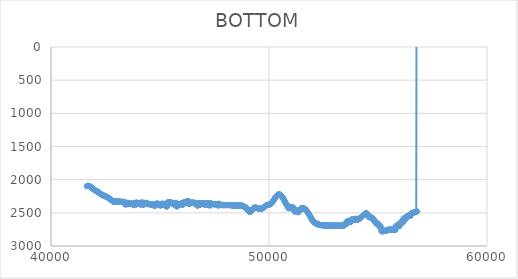
| Category | BOTTOM |
|---|---|
| 41642.9925 | 2099.07 |
| 41650.1262 | 2097.25 |
| 41660.3657 | 2095.79 |
| 41670.6056 | 2094.67 |
| 41680.8456 | 2093.88 |
| 41691.0856 | 2093.4 |
| 41701.3256 | 2093.23 |
| 41711.5656 | 2093.35 |
| 41721.8055 | 2093.74 |
| 41732.0455 | 2094.4 |
| 41742.2855 | 2095.29 |
| 41752.5255 | 2096.42 |
| 41762.7654 | 2097.77 |
| 41773.0054 | 2099.32 |
| 41783.2454 | 2101.06 |
| 41793.4854 | 2102.98 |
| 41803.7254 | 2105.06 |
| 41813.9653 | 2107.28 |
| 41824.2053 | 2109.64 |
| 41834.4453 | 2112.12 |
| 41844.6853 | 2114.7 |
| 41854.9253 | 2117.37 |
| 41865.1652 | 2120.12 |
| 41875.4052 | 2122.93 |
| 41885.6452 | 2125.8 |
| 41895.8852 | 2128.69 |
| 41906.1252 | 2131.61 |
| 41916.3651 | 2134.53 |
| 41926.6051 | 2137.45 |
| 41936.8451 | 2140.34 |
| 41947.0851 | 2143.2 |
| 41957.3251 | 2146 |
| 41967.565 | 2148.75 |
| 41977.805 | 2151.41 |
| 41988.045 | 2153.98 |
| 41998.285 | 2156.45 |
| 42008.525 | 2158.8 |
| 42018.7649 | 2161.01 |
| 42029.0049 | 2163.08 |
| 42039.2449 | 2165.02 |
| 42049.4849 | 2166.87 |
| 42059.7248 | 2168.65 |
| 42069.9648 | 2170.39 |
| 42080.2048 | 2172.11 |
| 42090.4448 | 2173.83 |
| 42100.6848 | 2175.59 |
| 42110.9247 | 2177.4 |
| 42121.1647 | 2179.31 |
| 42131.4047 | 2181.31 |
| 42141.6447 | 2183.42 |
| 42151.8847 | 2185.62 |
| 42162.1246 | 2187.89 |
| 42172.3646 | 2190.23 |
| 42182.6046 | 2192.63 |
| 42192.8446 | 2195.07 |
| 42203.0846 | 2197.54 |
| 42213.3245 | 2200.03 |
| 42223.5645 | 2202.53 |
| 42233.8045 | 2205.04 |
| 42244.0445 | 2207.52 |
| 42254.2845 | 2209.98 |
| 42264.5244 | 2212.41 |
| 42274.7644 | 2214.79 |
| 42285.0044 | 2217.11 |
| 42295.2444 | 2219.36 |
| 42305.4843 | 2221.53 |
| 42315.7243 | 2223.62 |
| 42325.9643 | 2225.61 |
| 42336.2043 | 2227.52 |
| 42346.4443 | 2229.36 |
| 42356.6842 | 2231.13 |
| 42366.9242 | 2232.84 |
| 42377.1642 | 2234.48 |
| 42387.4042 | 2236.08 |
| 42397.6442 | 2237.63 |
| 42407.8841 | 2239.13 |
| 42418.1241 | 2240.61 |
| 42428.3641 | 2242.05 |
| 42438.6041 | 2243.47 |
| 42448.8441 | 2244.87 |
| 42459.084 | 2246.26 |
| 42469.324 | 2247.65 |
| 42479.564 | 2249.03 |
| 42489.804 | 2250.42 |
| 42500.0439 | 2251.82 |
| 42510.2839 | 2253.23 |
| 42520.5239 | 2254.67 |
| 42530.7639 | 2256.14 |
| 42541.0039 | 2257.64 |
| 42551.2438 | 2259.18 |
| 42561.4838 | 2260.77 |
| 42571.7238 | 2262.4 |
| 42581.9638 | 2264.1 |
| 42592.2038 | 2265.85 |
| 42602.4437 | 2267.68 |
| 42612.6837 | 2269.57 |
| 42622.9237 | 2271.55 |
| 42633.1637 | 2273.62 |
| 42643.4037 | 2275.77 |
| 42653.6436 | 2278.01 |
| 42663.8836 | 2280.33 |
| 42674.1236 | 2282.72 |
| 42684.3636 | 2285.19 |
| 42694.6035 | 2287.72 |
| 42704.8435 | 2290.31 |
| 42715.0835 | 2292.96 |
| 42725.3235 | 2295.65 |
| 42735.5635 | 2298.39 |
| 42745.8034 | 2301.17 |
| 42756.0434 | 2303.98 |
| 42766.2834 | 2306.82 |
| 42776.5234 | 2309.68 |
| 42786.7634 | 2312.56 |
| 42797.0033 | 2315.45 |
| 42807.2433 | 2318.35 |
| 42817.4833 | 2321.26 |
| 42827.7233 | 2324.15 |
| 42837.9632 | 2327.04 |
| 42848.2032 | 2329.92 |
| 42858.4432 | 2330.03 |
| 42868.6832 | 2330.14 |
| 42878.9232 | 2330.25 |
| 42889.1631 | 2330.36 |
| 42899.4031 | 2330.47 |
| 42909.6431 | 2330.58 |
| 42919.8831 | 2330.69 |
| 42930.1231 | 2330.8 |
| 42940.363 | 2330.91 |
| 42950.603 | 2331.03 |
| 42960.843 | 2331.14 |
| 42971.083 | 2331.25 |
| 42981.3229 | 2331.36 |
| 42991.5629 | 2331.47 |
| 43001.8029 | 2331.58 |
| 43012.0429 | 2331.69 |
| 43022.2829 | 2331.8 |
| 43032.5228 | 2331.91 |
| 43042.7628 | 2332.02 |
| 43053.0028 | 2332.13 |
| 43063.2428 | 2332.24 |
| 43073.4828 | 2332.35 |
| 43083.7227 | 2332.46 |
| 43093.9627 | 2332.57 |
| 43104.2027 | 2332.68 |
| 43114.4427 | 2332.79 |
| 43124.6827 | 2332.9 |
| 43134.9226 | 2333.01 |
| 43145.1626 | 2333.12 |
| 43155.4026 | 2333.23 |
| 43165.6426 | 2333.34 |
| 43175.8825 | 2333.45 |
| 43186.1225 | 2333.56 |
| 43196.3625 | 2333.68 |
| 43206.6025 | 2333.79 |
| 43216.8425 | 2333.9 |
| 43227.0824 | 2334.01 |
| 43237.3224 | 2334.12 |
| 43247.5624 | 2334.23 |
| 43257.8024 | 2334.34 |
| 43268.0423 | 2334.45 |
| 43278.2823 | 2334.56 |
| 43288.5223 | 2334.67 |
| 43298.7623 | 2334.78 |
| 43309.0023 | 2334.89 |
| 43319.2422 | 2335 |
| 43329.4822 | 2335.11 |
| 43339.7222 | 2335.22 |
| 43349.9622 | 2335.33 |
| 43360.2022 | 2335.44 |
| 43370.4421 | 2335.55 |
| 43380.6821 | 2369.33 |
| 43390.9221 | 2358.07 |
| 43401.1621 | 2365.11 |
| 43411.402 | 2362.3 |
| 43421.642 | 2379.19 |
| 43431.882 | 2360.89 |
| 43442.122 | 2349.63 |
| 43452.362 | 2351.04 |
| 43462.6019 | 2351.04 |
| 43472.8419 | 2348.22 |
| 43483.0819 | 2349.63 |
| 43493.3219 | 2363.7 |
| 43503.5619 | 2353.85 |
| 43513.8018 | 2372.15 |
| 43524.0418 | 2359.48 |
| 43534.2818 | 2359.48 |
| 43544.5218 | 2359.48 |
| 43554.7617 | 2349.63 |
| 43565.0017 | 2358.07 |
| 43575.2417 | 2358.07 |
| 43585.4817 | 2358.07 |
| 43595.7217 | 2363.7 |
| 43605.9616 | 2363.7 |
| 43616.2016 | 2365.11 |
| 43626.4416 | 2365.11 |
| 43636.6816 | 2358.07 |
| 43646.9216 | 2369.33 |
| 43657.1615 | 2362.3 |
| 43667.4015 | 2359.48 |
| 43677.6415 | 2359.48 |
| 43687.8815 | 2360.89 |
| 43698.1214 | 2366.52 |
| 43708.3614 | 2366.52 |
| 43718.6014 | 2365.11 |
| 43728.8414 | 2365.11 |
| 43739.0814 | 2367.93 |
| 43749.3213 | 2370.74 |
| 43759.5613 | 2372.15 |
| 43769.8013 | 2374.97 |
| 43780.0413 | 2370.74 |
| 43790.2812 | 2387.63 |
| 43800.5212 | 2369.33 |
| 43810.7612 | 2348.22 |
| 43821.0012 | 2349.63 |
| 43831.2412 | 2349.63 |
| 43841.4811 | 2355.26 |
| 43851.7211 | 2356.67 |
| 43861.9611 | 2358.07 |
| 43872.2011 | 2351.04 |
| 43882.4411 | 2362.3 |
| 43892.681 | 2379.19 |
| 43902.921 | 2349.63 |
| 43913.161 | 2348.22 |
| 43923.401 | 2346.81 |
| 43933.6409 | 2349.63 |
| 43943.8809 | 2349.63 |
| 43954.1209 | 2348.22 |
| 43964.3609 | 2348.22 |
| 43974.6009 | 2349.63 |
| 43984.8408 | 2349.63 |
| 43995.0808 | 2351.04 |
| 44005.3208 | 2352.44 |
| 44015.5608 | 2353.85 |
| 44025.8007 | 2353.85 |
| 44036.0407 | 2355.26 |
| 44046.2807 | 2356.67 |
| 44056.5207 | 2358.07 |
| 44066.7607 | 2359.48 |
| 44077.0006 | 2360.89 |
| 44087.2406 | 2352.44 |
| 44097.4806 | 2379.19 |
| 44107.7206 | 2355.26 |
| 44117.9605 | 2348.22 |
| 44128.2005 | 2363.7 |
| 44138.4405 | 2345.41 |
| 44148.6805 | 2344 |
| 44158.9205 | 2366.52 |
| 44169.1604 | 2352.44 |
| 44179.4004 | 2352.44 |
| 44189.6404 | 2352.44 |
| 44199.8804 | 2344 |
| 44210.1203 | 2379.19 |
| 44220.3603 | 2349.63 |
| 44230.6003 | 2349.63 |
| 44240.8403 | 2374.97 |
| 44251.0803 | 2372.15 |
| 44261.3202 | 2370.74 |
| 44271.5602 | 2349.63 |
| 44281.8002 | 2369.33 |
| 44292.0402 | 2367.93 |
| 44302.2802 | 2367.93 |
| 44312.5201 | 2366.52 |
| 44322.7601 | 2349.63 |
| 44333.0001 | 2349.63 |
| 44343.2401 | 2360.89 |
| 44353.48 | 2363.7 |
| 44363.72 | 2353.85 |
| 44373.96 | 2353.85 |
| 44384.2 | 2363.7 |
| 44394.44 | 2355.26 |
| 44404.6799 | 2356.67 |
| 44414.9199 | 2360.89 |
| 44425.1599 | 2360.89 |
| 44435.3999 | 2365.11 |
| 44445.6398 | 2362.3 |
| 44455.8798 | 2363.7 |
| 44466.1198 | 2365.11 |
| 44476.3598 | 2365.11 |
| 44486.5998 | 2366.52 |
| 44496.8397 | 2367.93 |
| 44507.0797 | 2367.93 |
| 44517.3197 | 2369.33 |
| 44527.5597 | 2370.74 |
| 44537.7996 | 2370.74 |
| 44548.0396 | 2372.15 |
| 44558.2796 | 2373.56 |
| 44568.5196 | 2374.97 |
| 44578.7596 | 2372.15 |
| 44588.9995 | 2379.19 |
| 44599.2395 | 2377.78 |
| 44609.4795 | 2377.78 |
| 44619.7195 | 2370.74 |
| 44629.9594 | 2372.15 |
| 44640.1994 | 2373.56 |
| 44650.4394 | 2374.97 |
| 44660.6794 | 2387.63 |
| 44670.9194 | 2377.78 |
| 44681.1593 | 2377.78 |
| 44691.3993 | 2379.19 |
| 44701.6393 | 2380.6 |
| 44711.8793 | 2382 |
| 44722.1192 | 2383.41 |
| 44732.3592 | 2386.23 |
| 44742.5992 | 2387.63 |
| 44752.8392 | 2389.04 |
| 44763.0792 | 2391.86 |
| 44773.3191 | 2393.26 |
| 44783.5591 | 2394.67 |
| 44793.7991 | 2367.93 |
| 44804.0391 | 2367.93 |
| 44814.279 | 2366.52 |
| 44824.519 | 2363.7 |
| 44834.759 | 2363.7 |
| 44844.999 | 2363.7 |
| 44855.239 | 2362.3 |
| 44865.4789 | 2362.3 |
| 44875.7189 | 2362.3 |
| 44885.9589 | 2360.89 |
| 44896.1989 | 2362.3 |
| 44906.4388 | 2367.93 |
| 44916.6788 | 2369.33 |
| 44926.9188 | 2370.74 |
| 44937.1588 | 2369.33 |
| 44947.3987 | 2376.37 |
| 44957.6387 | 2374.97 |
| 44967.8787 | 2376.37 |
| 44978.1187 | 2380.6 |
| 44988.3587 | 2380.6 |
| 44998.5986 | 2386.23 |
| 45008.8386 | 2386.23 |
| 45019.0786 | 2370.74 |
| 45029.3186 | 2393.26 |
| 45039.5585 | 2367.93 |
| 45049.7985 | 2369.33 |
| 45060.0385 | 2369.33 |
| 45070.2785 | 2369.33 |
| 45080.5185 | 2369.33 |
| 45090.7584 | 2370.74 |
| 45100.9984 | 2360.89 |
| 45111.2384 | 2362.3 |
| 45121.4784 | 2370.74 |
| 45131.7183 | 2370.74 |
| 45141.9583 | 2372.15 |
| 45152.1983 | 2373.56 |
| 45162.4383 | 2373.56 |
| 45172.6783 | 2377.78 |
| 45182.9182 | 2374.97 |
| 45193.1582 | 2374.97 |
| 45203.3982 | 2360.89 |
| 45213.6382 | 2387.63 |
| 45223.8781 | 2382 |
| 45234.1181 | 2383.41 |
| 45244.3581 | 2393.26 |
| 45254.5981 | 2394.67 |
| 45264.8381 | 2397.49 |
| 45275.078 | 2397.49 |
| 45285.318 | 2390.45 |
| 45295.558 | 2405.93 |
| 45305.798 | 2403.12 |
| 45316.0379 | 2401.71 |
| 45326.2779 | 2403.12 |
| 45336.5179 | 2373.56 |
| 45346.7579 | 2344 |
| 45356.9978 | 2345.41 |
| 45367.2378 | 2341.18 |
| 45377.4778 | 2341.18 |
| 45387.7178 | 2339.77 |
| 45397.9578 | 2342.59 |
| 45408.1977 | 2344 |
| 45418.4377 | 2342.59 |
| 45428.6777 | 2341.18 |
| 45438.9177 | 2348.22 |
| 45449.1576 | 2351.04 |
| 45459.3976 | 2351.04 |
| 45469.6376 | 2352.44 |
| 45479.8776 | 2353.85 |
| 45490.1176 | 2355.26 |
| 45500.3575 | 2341.18 |
| 45510.5975 | 2345.41 |
| 45520.8375 | 2342.59 |
| 45531.0775 | 2348.22 |
| 45541.3174 | 2348.22 |
| 45551.5574 | 2349.63 |
| 45561.7974 | 2359.48 |
| 45572.0374 | 2352.44 |
| 45582.2773 | 2363.7 |
| 45592.5173 | 2358.07 |
| 45602.7573 | 2358.07 |
| 45612.9973 | 2365.11 |
| 45623.2373 | 2363.7 |
| 45633.4772 | 2369.33 |
| 45643.7172 | 2373.56 |
| 45653.9572 | 2373.56 |
| 45664.1972 | 2380.6 |
| 45674.4371 | 2387.63 |
| 45684.6771 | 2386.23 |
| 45694.9171 | 2353.85 |
| 45705.1571 | 2382 |
| 45715.3971 | 2366.52 |
| 45725.637 | 2358.07 |
| 45735.877 | 2346.81 |
| 45746.117 | 2377.78 |
| 45756.357 | 2377.78 |
| 45766.5969 | 2376.37 |
| 45776.8369 | 2407.34 |
| 45787.0769 | 2372.15 |
| 45797.3169 | 2372.15 |
| 45807.5568 | 2396.08 |
| 45817.7968 | 2366.52 |
| 45828.0368 | 2389.04 |
| 45838.2768 | 2386.23 |
| 45848.5168 | 2382 |
| 45858.7567 | 2380.6 |
| 45868.9967 | 2380.6 |
| 45879.2367 | 2373.56 |
| 45889.4767 | 2380.6 |
| 45899.7166 | 2374.97 |
| 45909.9566 | 2370.74 |
| 45920.1966 | 2367.93 |
| 45930.4366 | 2367.93 |
| 45940.6765 | 2363.7 |
| 45950.9165 | 2363.7 |
| 45961.1565 | 2365.11 |
| 45971.3965 | 2358.07 |
| 45981.6365 | 2358.07 |
| 45991.8764 | 2367.93 |
| 46002.1164 | 2367.93 |
| 46012.3564 | 2373.56 |
| 46022.5964 | 2374.97 |
| 46032.8363 | 2376.37 |
| 46043.0763 | 2372.15 |
| 46053.3163 | 2372.15 |
| 46063.5563 | 2374.97 |
| 46073.7962 | 2344 |
| 46084.0362 | 2345.41 |
| 46094.2762 | 2345.41 |
| 46104.5162 | 2345.41 |
| 46114.7562 | 2338.37 |
| 46124.9961 | 2338.37 |
| 46135.2361 | 2339.77 |
| 46145.4761 | 2332.74 |
| 46155.7161 | 2332.74 |
| 46165.956 | 2345.41 |
| 46176.196 | 2344 |
| 46186.436 | 2346.81 |
| 46196.676 | 2346.81 |
| 46206.9159 | 2349.63 |
| 46217.1559 | 2352.44 |
| 46227.3959 | 2331.33 |
| 46237.6359 | 2328.51 |
| 46247.8759 | 2327.11 |
| 46258.1158 | 2331.33 |
| 46268.3558 | 2359.48 |
| 46278.5958 | 2353.85 |
| 46288.8358 | 2327.11 |
| 46299.0757 | 2325.7 |
| 46309.3157 | 2331.33 |
| 46319.5557 | 2324.29 |
| 46329.7957 | 2332.74 |
| 46340.0356 | 2366.52 |
| 46350.2756 | 2362.3 |
| 46360.5156 | 2362.3 |
| 46370.7556 | 2360.89 |
| 46380.9956 | 2353.85 |
| 46391.2355 | 2352.44 |
| 46401.4755 | 2352.44 |
| 46411.7155 | 2352.44 |
| 46421.9555 | 2352.44 |
| 46432.1954 | 2351.04 |
| 46442.4354 | 2349.63 |
| 46452.6754 | 2348.22 |
| 46462.9154 | 2348.22 |
| 46473.1553 | 2349.63 |
| 46483.3953 | 2349.63 |
| 46493.6353 | 2349.63 |
| 46503.8753 | 2346.81 |
| 46514.1153 | 2348.22 |
| 46524.3552 | 2348.22 |
| 46534.5952 | 2346.81 |
| 46544.8352 | 2348.22 |
| 46555.0752 | 2348.22 |
| 46565.3151 | 2348.22 |
| 46575.5551 | 2348.22 |
| 46585.7951 | 2359.48 |
| 46596.0351 | 2356.67 |
| 46606.275 | 2362.3 |
| 46616.515 | 2369.33 |
| 46626.755 | 2367.93 |
| 46636.995 | 2367.93 |
| 46647.235 | 2365.11 |
| 46657.4749 | 2363.7 |
| 46667.7149 | 2362.3 |
| 46677.9549 | 2363.7 |
| 46688.1949 | 2362.3 |
| 46698.4348 | 2360.89 |
| 46708.6748 | 2362.3 |
| 46718.9148 | 2397.49 |
| 46729.1548 | 2369.33 |
| 46739.3947 | 2356.67 |
| 46749.6347 | 2358.07 |
| 46759.8747 | 2365.11 |
| 46770.1147 | 2362.3 |
| 46780.3546 | 2367.93 |
| 46790.5946 | 2358.07 |
| 46800.8346 | 2373.56 |
| 46811.0746 | 2373.56 |
| 46821.3146 | 2374.97 |
| 46831.5545 | 2377.78 |
| 46841.7945 | 2379.19 |
| 46852.0345 | 2349.63 |
| 46862.2745 | 2351.04 |
| 46872.5144 | 2352.44 |
| 46882.7544 | 2370.74 |
| 46892.9944 | 2365.11 |
| 46903.2344 | 2365.11 |
| 46913.4743 | 2362.3 |
| 46923.7143 | 2359.48 |
| 46933.9543 | 2359.48 |
| 46944.1943 | 2358.07 |
| 46954.4342 | 2356.67 |
| 46964.6742 | 2358.07 |
| 46974.9142 | 2359.48 |
| 46985.1542 | 2359.48 |
| 46995.3942 | 2358.07 |
| 47005.6341 | 2356.67 |
| 47015.8741 | 2356.67 |
| 47026.1141 | 2360.89 |
| 47036.3541 | 2360.89 |
| 47046.594 | 2376.37 |
| 47056.834 | 2379.19 |
| 47067.074 | 2360.89 |
| 47077.314 | 2362.3 |
| 47087.5539 | 2363.7 |
| 47097.7939 | 2366.52 |
| 47108.0339 | 2358.07 |
| 47118.2739 | 2365.11 |
| 47128.5138 | 2374.97 |
| 47138.7538 | 2376.37 |
| 47148.9938 | 2356.67 |
| 47159.2338 | 2355.26 |
| 47169.4738 | 2353.85 |
| 47179.7137 | 2384.82 |
| 47189.9537 | 2353.85 |
| 47200.1937 | 2365.11 |
| 47210.4337 | 2363.7 |
| 47220.6736 | 2360.89 |
| 47230.9136 | 2373.56 |
| 47241.1536 | 2370.74 |
| 47251.3936 | 2369.33 |
| 47261.6335 | 2369.33 |
| 47271.8735 | 2390.45 |
| 47282.1135 | 2387.63 |
| 47292.3535 | 2386.23 |
| 47302.5934 | 2377.78 |
| 47312.8334 | 2352.44 |
| 47323.0734 | 2358.07 |
| 47333.3134 | 2358.07 |
| 47343.5533 | 2372.15 |
| 47353.7933 | 2365.11 |
| 47364.0333 | 2367.93 |
| 47374.2733 | 2366.52 |
| 47384.5133 | 2365.11 |
| 47394.7532 | 2362.3 |
| 47404.9932 | 2369.33 |
| 47415.2332 | 2369.33 |
| 47425.4732 | 2367.93 |
| 47435.7131 | 2366.52 |
| 47445.9531 | 2366.52 |
| 47456.1931 | 2366.52 |
| 47466.4331 | 2366.52 |
| 47476.673 | 2366.52 |
| 47486.913 | 2373.56 |
| 47497.153 | 2373.56 |
| 47507.393 | 2372.15 |
| 47517.6329 | 2370.74 |
| 47527.8729 | 2369.33 |
| 47538.1129 | 2367.93 |
| 47548.3529 | 2367.93 |
| 47558.5928 | 2367.93 |
| 47568.8328 | 2367.93 |
| 47579.0728 | 2370.74 |
| 47589.3128 | 2370.74 |
| 47599.5528 | 2373.56 |
| 47609.7927 | 2374.97 |
| 47620.0327 | 2366.52 |
| 47630.2727 | 2380.6 |
| 47640.5127 | 2382 |
| 47650.7526 | 2367.93 |
| 47660.9926 | 2369.33 |
| 47671.2326 | 2393.26 |
| 47681.4726 | 2363.7 |
| 47691.7125 | 2363.7 |
| 47701.9525 | 2365.11 |
| 47712.1925 | 2365.11 |
| 47722.4325 | 2366.52 |
| 47732.6724 | 2382 |
| 47742.9124 | 2383.41 |
| 47753.1524 | 2383.41 |
| 47763.3924 | 2370.74 |
| 47773.6323 | 2372.15 |
| 47783.8723 | 2379.19 |
| 47794.1123 | 2383.41 |
| 47804.3523 | 2383.41 |
| 47814.5923 | 2383.41 |
| 47824.8322 | 2383.41 |
| 47835.0722 | 2383.41 |
| 47845.3122 | 2383.41 |
| 47855.5522 | 2383.41 |
| 47865.7921 | 2383.41 |
| 47876.0321 | 2383.41 |
| 47886.2721 | 2383.41 |
| 47896.5121 | 2383.41 |
| 47906.752 | 2383.41 |
| 47916.992 | 2383.41 |
| 47927.232 | 2383.41 |
| 47937.472 | 2383.41 |
| 47947.7119 | 2383.41 |
| 47957.9519 | 2383.41 |
| 47968.1919 | 2383.41 |
| 47978.4319 | 2383.41 |
| 47988.6718 | 2383.41 |
| 47998.9118 | 2383.41 |
| 48009.1518 | 2383.41 |
| 48019.3918 | 2383.41 |
| 48029.6317 | 2383.41 |
| 48039.8717 | 2383.41 |
| 48050.1117 | 2383.41 |
| 48060.3517 | 2383.41 |
| 48070.5916 | 2383.41 |
| 48080.8316 | 2383.41 |
| 48091.0716 | 2383.41 |
| 48101.3116 | 2383.41 |
| 48111.5516 | 2383.41 |
| 48121.7915 | 2383.41 |
| 48132.0315 | 2383.41 |
| 48142.2715 | 2383.41 |
| 48152.5115 | 2383.41 |
| 48162.7514 | 2383.41 |
| 48172.9914 | 2383.41 |
| 48183.2314 | 2383.41 |
| 48193.4714 | 2383.41 |
| 48203.7113 | 2383.41 |
| 48213.9513 | 2383.41 |
| 48224.1913 | 2383.41 |
| 48234.4313 | 2383.41 |
| 48244.6712 | 2383.41 |
| 48254.9112 | 2384.23 |
| 48265.1512 | 2384.98 |
| 48275.3912 | 2385.65 |
| 48285.6311 | 2386.25 |
| 48295.8711 | 2386.79 |
| 48306.1111 | 2387.26 |
| 48316.3511 | 2387.67 |
| 48326.591 | 2388.03 |
| 48336.831 | 2388.33 |
| 48347.071 | 2388.59 |
| 48357.311 | 2388.79 |
| 48367.5509 | 2388.95 |
| 48377.7909 | 2389.07 |
| 48388.0309 | 2389.15 |
| 48398.2709 | 2389.2 |
| 48408.5108 | 2389.21 |
| 48418.7508 | 2389.2 |
| 48428.9908 | 2389.16 |
| 48439.2308 | 2389.09 |
| 48449.4708 | 2389.01 |
| 48459.7107 | 2388.91 |
| 48469.9507 | 2388.8 |
| 48480.1907 | 2388.68 |
| 48490.4307 | 2388.56 |
| 48500.6706 | 2388.43 |
| 48510.9106 | 2388.3 |
| 48521.1506 | 2388.17 |
| 48531.3906 | 2388.05 |
| 48541.6305 | 2387.93 |
| 48551.8705 | 2387.83 |
| 48562.1105 | 2387.75 |
| 48572.3505 | 2387.68 |
| 48582.5904 | 2387.63 |
| 48592.8304 | 2387.61 |
| 48603.0704 | 2387.62 |
| 48613.3104 | 2387.66 |
| 48623.5503 | 2387.73 |
| 48633.7903 | 2387.84 |
| 48644.0303 | 2387.99 |
| 48654.2703 | 2388.19 |
| 48664.5102 | 2388.43 |
| 48674.7502 | 2388.72 |
| 48684.9902 | 2389.06 |
| 48695.2302 | 2389.46 |
| 48705.4701 | 2389.92 |
| 48715.7101 | 2390.44 |
| 48725.9501 | 2391.03 |
| 48736.1901 | 2391.68 |
| 48746.43 | 2392.41 |
| 48756.67 | 2393.21 |
| 48766.91 | 2394.1 |
| 48777.15 | 2395.06 |
| 48787.3899 | 2396.1 |
| 48797.6299 | 2397.24 |
| 48807.8699 | 2398.46 |
| 48818.1099 | 2399.78 |
| 48828.3498 | 2401.2 |
| 48838.5898 | 2402.71 |
| 48848.8298 | 2404.33 |
| 48859.0698 | 2406.06 |
| 48869.3097 | 2407.89 |
| 48879.5497 | 2409.84 |
| 48889.7897 | 2411.91 |
| 48900.0297 | 2414.09 |
| 48910.2697 | 2416.39 |
| 48920.5096 | 2418.83 |
| 48930.7496 | 2421.38 |
| 48940.9896 | 2424.07 |
| 48951.2296 | 2426.9 |
| 48961.4695 | 2429.86 |
| 48971.7095 | 2432.97 |
| 48981.9495 | 2436.21 |
| 48992.1895 | 2439.61 |
| 49002.4294 | 2443.15 |
| 49012.6694 | 2446.85 |
| 49022.9094 | 2450.71 |
| 49033.1494 | 2454.73 |
| 49043.3893 | 2458.9 |
| 49053.6293 | 2463.25 |
| 49063.8693 | 2467.76 |
| 49074.1093 | 2472.45 |
| 49084.3492 | 2477.31 |
| 49094.5892 | 2482.35 |
| 49104.8292 | 2487.57 |
| 49115.0692 | 2487.25 |
| 49125.3091 | 2486.21 |
| 49135.5491 | 2484.55 |
| 49145.7891 | 2482.32 |
| 49156.0291 | 2479.6 |
| 49166.269 | 2476.45 |
| 49176.509 | 2472.95 |
| 49186.749 | 2469.18 |
| 49196.989 | 2465.19 |
| 49207.2289 | 2461.05 |
| 49217.4689 | 2456.85 |
| 49227.7089 | 2452.65 |
| 49237.9489 | 2448.51 |
| 49248.1888 | 2444.52 |
| 49258.4288 | 2440.74 |
| 49268.6688 | 2437.24 |
| 49278.9088 | 2434.08 |
| 49289.1487 | 2431.34 |
| 49299.3887 | 2428.99 |
| 49309.6287 | 2427.03 |
| 49319.8687 | 2425.42 |
| 49330.1086 | 2424.15 |
| 49340.3486 | 2423.19 |
| 49350.5886 | 2422.53 |
| 49360.8286 | 2422.15 |
| 49371.0685 | 2422.01 |
| 49381.3085 | 2422.11 |
| 49391.5485 | 2422.41 |
| 49401.7885 | 2422.91 |
| 49412.0284 | 2423.57 |
| 49422.2684 | 2424.38 |
| 49432.5084 | 2425.31 |
| 49442.7484 | 2426.35 |
| 49452.9883 | 2427.47 |
| 49463.2283 | 2428.66 |
| 49473.4683 | 2429.88 |
| 49483.7083 | 2431.12 |
| 49493.9482 | 2432.37 |
| 49504.1882 | 2433.59 |
| 49514.4282 | 2434.76 |
| 49524.6682 | 2435.87 |
| 49534.9081 | 2436.9 |
| 49545.1481 | 2437.82 |
| 49555.3881 | 2438.62 |
| 49565.6281 | 2439.3 |
| 49575.868 | 2439.84 |
| 49586.108 | 2440.24 |
| 49596.348 | 2440.48 |
| 49606.588 | 2440.56 |
| 49616.8279 | 2440.46 |
| 49627.0679 | 2440.18 |
| 49637.3079 | 2439.7 |
| 49647.5479 | 2439.02 |
| 49657.7878 | 2438.13 |
| 49668.0278 | 2437.02 |
| 49678.2678 | 2435.67 |
| 49688.5078 | 2434.08 |
| 49698.7477 | 2432.25 |
| 49708.9877 | 2430.2 |
| 49719.2277 | 2427.95 |
| 49729.4677 | 2425.52 |
| 49739.7076 | 2422.96 |
| 49749.9476 | 2420.28 |
| 49760.1876 | 2417.51 |
| 49770.4276 | 2414.69 |
| 49780.6675 | 2411.82 |
| 49790.9075 | 2408.96 |
| 49801.1475 | 2406.11 |
| 49811.3875 | 2403.31 |
| 49821.6274 | 2400.58 |
| 49831.8674 | 2397.96 |
| 49842.1074 | 2395.47 |
| 49852.3474 | 2393.13 |
| 49862.5873 | 2390.98 |
| 49872.8273 | 2389.04 |
| 49883.0673 | 2387.33 |
| 49893.3073 | 2385.83 |
| 49903.5472 | 2384.51 |
| 49913.7872 | 2383.36 |
| 49924.0272 | 2382.33 |
| 49934.2672 | 2381.42 |
| 49944.5071 | 2380.58 |
| 49954.7471 | 2379.79 |
| 49964.9871 | 2379.03 |
| 49975.2271 | 2378.27 |
| 49985.467 | 2377.48 |
| 49995.707 | 2376.64 |
| 50005.947 | 2375.72 |
| 50016.187 | 2374.7 |
| 50026.4269 | 2373.54 |
| 50036.6669 | 2372.22 |
| 50046.9069 | 2370.71 |
| 50057.1469 | 2369 |
| 50067.3868 | 2367.04 |
| 50077.6268 | 2364.82 |
| 50087.8668 | 2362.31 |
| 50098.1068 | 2359.48 |
| 50108.3467 | 2356.32 |
| 50118.5867 | 2352.83 |
| 50128.8267 | 2349.05 |
| 50139.0667 | 2345 |
| 50149.3066 | 2340.71 |
| 50159.5466 | 2336.2 |
| 50169.7866 | 2331.5 |
| 50180.0266 | 2326.62 |
| 50190.2665 | 2321.61 |
| 50200.5065 | 2316.48 |
| 50210.7465 | 2311.25 |
| 50220.9865 | 2305.96 |
| 50231.2264 | 2300.63 |
| 50241.4664 | 2295.28 |
| 50251.7064 | 2289.94 |
| 50261.9464 | 2284.63 |
| 50272.1863 | 2279.39 |
| 50282.4263 | 2274.22 |
| 50292.6663 | 2269.17 |
| 50302.9063 | 2264.25 |
| 50313.1462 | 2259.5 |
| 50323.3862 | 2254.92 |
| 50333.6262 | 2250.56 |
| 50343.8661 | 2246.44 |
| 50354.1061 | 2242.57 |
| 50364.3461 | 2238.99 |
| 50374.5861 | 2235.73 |
| 50384.826 | 2232.8 |
| 50395.066 | 2230.22 |
| 50405.306 | 2228.02 |
| 50415.546 | 2226.18 |
| 50425.7859 | 2224.71 |
| 50436.0259 | 2223.61 |
| 50446.2659 | 2222.89 |
| 50456.5059 | 2222.55 |
| 50466.7458 | 2222.59 |
| 50476.9858 | 2223.01 |
| 50487.2258 | 2223.81 |
| 50497.4658 | 2225.01 |
| 50507.7057 | 2226.59 |
| 50517.9457 | 2228.57 |
| 50528.1857 | 2230.95 |
| 50538.4257 | 2233.7 |
| 50548.6656 | 2236.8 |
| 50558.9056 | 2240.25 |
| 50569.1456 | 2244.01 |
| 50579.3856 | 2248.08 |
| 50589.6255 | 2252.43 |
| 50599.8655 | 2257.03 |
| 50610.1055 | 2261.89 |
| 50620.3455 | 2266.96 |
| 50630.5854 | 2272.24 |
| 50640.8254 | 2277.7 |
| 50651.0654 | 2283.33 |
| 50661.3054 | 2289.1 |
| 50671.5453 | 2295 |
| 50681.7853 | 2301.01 |
| 50692.0253 | 2307.11 |
| 50702.2653 | 2313.27 |
| 50712.5052 | 2319.49 |
| 50722.7452 | 2325.74 |
| 50732.9852 | 2331.99 |
| 50743.2252 | 2338.24 |
| 50753.4651 | 2344.47 |
| 50763.7051 | 2350.64 |
| 50773.9451 | 2356.75 |
| 50784.1851 | 2362.78 |
| 50794.425 | 2368.7 |
| 50804.665 | 2374.5 |
| 50814.905 | 2380.16 |
| 50825.1449 | 2385.65 |
| 50835.3849 | 2390.97 |
| 50845.6249 | 2396.08 |
| 50855.8649 | 2410.16 |
| 50866.1048 | 2412.97 |
| 50876.3448 | 2415.79 |
| 50886.5848 | 2414.38 |
| 50896.8248 | 2434.08 |
| 50907.0647 | 2417.19 |
| 50917.3047 | 2418.6 |
| 50927.5447 | 2417.19 |
| 50937.7847 | 2418.6 |
| 50948.0246 | 2417.19 |
| 50958.2646 | 2420.01 |
| 50968.5046 | 2418.6 |
| 50978.7446 | 2422.82 |
| 50988.9845 | 2425.64 |
| 50999.2245 | 2411.56 |
| 51009.4645 | 2411.56 |
| 51019.7045 | 2410.16 |
| 51029.9444 | 2411.56 |
| 51040.1844 | 2436.9 |
| 51050.4244 | 2412.97 |
| 51060.6644 | 2431.27 |
| 51070.9043 | 2417.19 |
| 51081.1443 | 2421.42 |
| 51091.3843 | 2418.6 |
| 51101.6243 | 2422.82 |
| 51111.8642 | 2422.82 |
| 51122.1042 | 2427.05 |
| 51132.3442 | 2462.24 |
| 51142.5841 | 2427.05 |
| 51152.8241 | 2446.75 |
| 51163.0641 | 2456.61 |
| 51173.3041 | 2483.35 |
| 51183.544 | 2458.01 |
| 51193.784 | 2479.13 |
| 51204.024 | 2479.13 |
| 51214.264 | 2462.24 |
| 51224.5039 | 2459.42 |
| 51234.7439 | 2460.83 |
| 51244.9839 | 2460.83 |
| 51255.2239 | 2462.24 |
| 51265.4638 | 2465.05 |
| 51275.7038 | 2465.05 |
| 51285.9438 | 2469.28 |
| 51296.1838 | 2469.28 |
| 51306.4237 | 2474.91 |
| 51316.6637 | 2483.35 |
| 51326.9037 | 2484.76 |
| 51337.1437 | 2484.76 |
| 51347.3836 | 2493.2 |
| 51357.6236 | 2486.25 |
| 51367.8636 | 2479.74 |
| 51378.1036 | 2473.66 |
| 51388.3435 | 2468.01 |
| 51398.5835 | 2462.77 |
| 51408.8235 | 2457.95 |
| 51419.0634 | 2453.53 |
| 51429.3034 | 2449.5 |
| 51439.5434 | 2445.86 |
| 51449.7834 | 2442.6 |
| 51460.0233 | 2439.72 |
| 51470.2633 | 2437.19 |
| 51480.5033 | 2435.03 |
| 51490.7433 | 2433.21 |
| 51500.9832 | 2431.74 |
| 51511.2232 | 2430.6 |
| 51521.4632 | 2429.78 |
| 51531.7032 | 2429.29 |
| 51541.9431 | 2429.11 |
| 51552.1831 | 2429.23 |
| 51562.4231 | 2429.64 |
| 51572.6631 | 2430.35 |
| 51582.903 | 2431.33 |
| 51593.143 | 2432.59 |
| 51603.383 | 2434.11 |
| 51613.623 | 2435.89 |
| 51623.8629 | 2437.92 |
| 51634.1029 | 2440.2 |
| 51644.3429 | 2442.71 |
| 51654.5828 | 2445.44 |
| 51664.8228 | 2448.4 |
| 51675.0628 | 2451.56 |
| 51685.3028 | 2454.93 |
| 51695.5427 | 2458.5 |
| 51705.7827 | 2462.26 |
| 51716.0227 | 2466.2 |
| 51726.2627 | 2470.31 |
| 51736.5026 | 2474.59 |
| 51746.7426 | 2479.02 |
| 51756.9826 | 2483.61 |
| 51767.2226 | 2488.34 |
| 51777.4625 | 2493.2 |
| 51787.7025 | 2498.2 |
| 51797.9425 | 2503.31 |
| 51808.1825 | 2508.54 |
| 51818.4224 | 2513.87 |
| 51828.6624 | 2519.3 |
| 51838.9024 | 2524.82 |
| 51849.1424 | 2530.42 |
| 51859.3823 | 2536.09 |
| 51869.6223 | 2541.84 |
| 51879.8623 | 2547.64 |
| 51890.1022 | 2553.49 |
| 51900.3422 | 2559.39 |
| 51910.5822 | 2565.32 |
| 51920.8222 | 2571.28 |
| 51931.0621 | 2577.26 |
| 51941.3021 | 2583.26 |
| 51951.5421 | 2589.26 |
| 51961.7821 | 2595.26 |
| 51972.022 | 2601.25 |
| 51982.262 | 2607.22 |
| 51992.502 | 2611.78 |
| 52002.742 | 2616.14 |
| 52012.9819 | 2620.28 |
| 52023.2219 | 2624.23 |
| 52033.4619 | 2627.99 |
| 52043.7019 | 2631.57 |
| 52053.9418 | 2634.96 |
| 52064.1818 | 2638.18 |
| 52074.4218 | 2641.23 |
| 52084.6617 | 2644.13 |
| 52094.9017 | 2646.86 |
| 52105.1417 | 2649.45 |
| 52115.3817 | 2651.89 |
| 52125.6216 | 2654.2 |
| 52135.8616 | 2656.38 |
| 52146.1016 | 2658.43 |
| 52156.3416 | 2660.36 |
| 52166.5815 | 2662.18 |
| 52176.8215 | 2663.89 |
| 52187.0615 | 2665.5 |
| 52197.3015 | 2667.01 |
| 52207.5414 | 2668.44 |
| 52217.7814 | 2669.78 |
| 52228.0214 | 2671.05 |
| 52238.2613 | 2672.25 |
| 52248.5013 | 2673.38 |
| 52258.7413 | 2674.45 |
| 52268.9813 | 2675.47 |
| 52279.2212 | 2676.43 |
| 52289.4612 | 2677.35 |
| 52299.7012 | 2678.21 |
| 52309.9412 | 2679.04 |
| 52320.1811 | 2679.82 |
| 52330.4211 | 2680.57 |
| 52340.6611 | 2681.28 |
| 52350.9011 | 2681.96 |
| 52361.141 | 2682.61 |
| 52371.381 | 2683.23 |
| 52381.621 | 2683.83 |
| 52391.861 | 2684.41 |
| 52402.1009 | 2684.97 |
| 52412.3409 | 2685.51 |
| 52422.5809 | 2686.02 |
| 52432.8208 | 2686.51 |
| 52443.0608 | 2686.98 |
| 52453.3008 | 2687.43 |
| 52463.5408 | 2687.86 |
| 52473.7807 | 2688.27 |
| 52484.0207 | 2688.66 |
| 52494.2607 | 2689.03 |
| 52504.5007 | 2689.38 |
| 52514.7406 | 2689.71 |
| 52524.9806 | 2690.02 |
| 52535.2206 | 2690.31 |
| 52545.4606 | 2690.58 |
| 52555.7005 | 2690.84 |
| 52565.9405 | 2691.08 |
| 52576.1805 | 2691.29 |
| 52586.4204 | 2691.5 |
| 52596.6604 | 2691.68 |
| 52606.9004 | 2691.85 |
| 52617.1404 | 2691.99 |
| 52627.3803 | 2692.13 |
| 52637.6203 | 2692.24 |
| 52647.8603 | 2692.34 |
| 52658.1003 | 2692.43 |
| 52668.3402 | 2692.5 |
| 52678.5802 | 2692.55 |
| 52688.8202 | 2692.59 |
| 52699.0602 | 2692.61 |
| 52709.3001 | 2692.62 |
| 52719.5401 | 2692.62 |
| 52729.7801 | 2692.6 |
| 52740.02 | 2692.56 |
| 52750.26 | 2692.52 |
| 52760.5 | 2692.46 |
| 52770.74 | 2692.38 |
| 52780.9799 | 2692.3 |
| 52791.2199 | 2692.2 |
| 52801.4599 | 2692.08 |
| 52811.6999 | 2691.96 |
| 52821.9398 | 2691.83 |
| 52832.1798 | 2691.68 |
| 52842.4198 | 2694.49 |
| 52852.6598 | 2694.49 |
| 52862.8997 | 2694.49 |
| 52873.1397 | 2694.49 |
| 52883.3797 | 2694.49 |
| 52893.6196 | 2694.49 |
| 52903.8596 | 2694.49 |
| 52914.0996 | 2694.49 |
| 52924.3396 | 2694.49 |
| 52934.5795 | 2694.49 |
| 52944.8195 | 2694.49 |
| 52955.0595 | 2694.49 |
| 52965.2995 | 2694.49 |
| 52975.5394 | 2694.49 |
| 52985.7794 | 2694.49 |
| 52996.0194 | 2694.49 |
| 53006.2593 | 2694.49 |
| 53016.4993 | 2694.49 |
| 53026.7393 | 2694.49 |
| 53036.9793 | 2694.49 |
| 53047.2192 | 2694.49 |
| 53057.4592 | 2694.49 |
| 53067.6992 | 2694.49 |
| 53077.9392 | 2694.49 |
| 53088.1791 | 2694.49 |
| 53098.4191 | 2694.49 |
| 53108.6591 | 2694.49 |
| 53118.8991 | 2694.49 |
| 53129.139 | 2694.49 |
| 53139.379 | 2694.49 |
| 53149.619 | 2694.49 |
| 53159.8589 | 2694.49 |
| 53170.0989 | 2694.49 |
| 53180.3389 | 2694.49 |
| 53190.5789 | 2694.49 |
| 53200.8188 | 2694.49 |
| 53211.0588 | 2694.49 |
| 53221.2988 | 2694.49 |
| 53231.5388 | 2694.49 |
| 53241.7787 | 2694.49 |
| 53252.0187 | 2694.49 |
| 53262.2587 | 2694.49 |
| 53272.4986 | 2694.49 |
| 53282.7386 | 2694.49 |
| 53292.9786 | 2694.49 |
| 53303.2186 | 2694.49 |
| 53313.4585 | 2694.49 |
| 53323.6985 | 2694.49 |
| 53333.9385 | 2694.49 |
| 53344.1785 | 2694.49 |
| 53354.4184 | 2694.49 |
| 53364.6584 | 2694.49 |
| 53374.8984 | 2690.27 |
| 53385.1383 | 2690.27 |
| 53395.3783 | 2702.94 |
| 53405.6183 | 2688.86 |
| 53415.8583 | 2693.09 |
| 53426.0982 | 2684.64 |
| 53436.3382 | 2681.83 |
| 53446.5782 | 2680.42 |
| 53456.8182 | 2677.6 |
| 53467.0581 | 2677.6 |
| 53477.2981 | 2676.19 |
| 53487.5381 | 2673.38 |
| 53497.7781 | 2673.38 |
| 53508.018 | 2671.97 |
| 53518.258 | 2670.56 |
| 53528.498 | 2670.56 |
| 53538.7379 | 2641 |
| 53548.9779 | 2674.79 |
| 53559.2179 | 2643.82 |
| 53569.4579 | 2632.56 |
| 53579.6978 | 2635.37 |
| 53589.9378 | 2626.93 |
| 53600.1778 | 2626.93 |
| 53610.4178 | 2625.52 |
| 53620.6577 | 2625.52 |
| 53630.8977 | 2625.52 |
| 53641.1377 | 2625.52 |
| 53651.3776 | 2625.52 |
| 53661.6176 | 2625.52 |
| 53671.8576 | 2625.52 |
| 53682.0976 | 2626.93 |
| 53692.3375 | 2628.34 |
| 53702.5775 | 2628.34 |
| 53712.8175 | 2631.15 |
| 53723.0575 | 2638.19 |
| 53733.2974 | 2639.6 |
| 53743.5374 | 2639.6 |
| 53753.7774 | 2636.78 |
| 53764.0173 | 2603 |
| 53774.2573 | 2603 |
| 53784.4973 | 2607.22 |
| 53794.7373 | 2601.59 |
| 53804.9772 | 2608.63 |
| 53815.2172 | 2604.41 |
| 53825.4572 | 2603 |
| 53835.6971 | 2604.41 |
| 53845.9371 | 2605.81 |
| 53856.1771 | 2605.81 |
| 53866.4171 | 2601.59 |
| 53876.657 | 2603 |
| 53886.897 | 2603 |
| 53897.137 | 2600.18 |
| 53907.377 | 2601.59 |
| 53917.6169 | 2601.59 |
| 53927.8569 | 2601.59 |
| 53938.0969 | 2608.63 |
| 53948.3368 | 2610.04 |
| 53958.5768 | 2594.55 |
| 53968.8168 | 2587.52 |
| 53979.0568 | 2595.96 |
| 53989.2967 | 2597.79 |
| 53999.5367 | 2599.26 |
| 54009.7767 | 2600.38 |
| 54020.0167 | 2601.17 |
| 54030.2566 | 2601.64 |
| 54040.4966 | 2601.8 |
| 54050.7366 | 2601.68 |
| 54060.9765 | 2601.27 |
| 54071.2165 | 2600.6 |
| 54081.4565 | 2599.67 |
| 54091.6965 | 2598.5 |
| 54101.9364 | 2597.11 |
| 54112.1764 | 2595.5 |
| 54122.4164 | 2593.7 |
| 54132.6564 | 2591.7 |
| 54142.8963 | 2589.54 |
| 54153.1363 | 2587.21 |
| 54163.3763 | 2584.73 |
| 54173.6162 | 2582.13 |
| 54183.8562 | 2579.4 |
| 54194.0962 | 2576.56 |
| 54204.3362 | 2573.63 |
| 54214.5761 | 2570.62 |
| 54224.8161 | 2567.55 |
| 54235.0561 | 2564.41 |
| 54245.2961 | 2561.24 |
| 54255.536 | 2558.04 |
| 54265.776 | 2554.83 |
| 54276.016 | 2551.61 |
| 54286.2559 | 2548.41 |
| 54296.4959 | 2545.23 |
| 54306.7359 | 2542.09 |
| 54316.9759 | 2539 |
| 54327.2158 | 2535.98 |
| 54337.4558 | 2533.03 |
| 54347.6958 | 2530.18 |
| 54357.9357 | 2527.43 |
| 54368.1757 | 2524.8 |
| 54378.4157 | 2522.3 |
| 54388.6557 | 2519.95 |
| 54398.8956 | 2517.75 |
| 54409.1356 | 2515.73 |
| 54419.3756 | 2513.89 |
| 54429.6156 | 2512.25 |
| 54439.8555 | 2510.81 |
| 54450.0955 | 2509.61 |
| 54460.3355 | 2508.63 |
| 54470.5754 | 2507.92 |
| 54480.8154 | 2507.46 |
| 54491.0554 | 2507.28 |
| 54501.2954 | 2525.58 |
| 54511.5353 | 2518.54 |
| 54521.7753 | 2526.99 |
| 54532.0153 | 2525.58 |
| 54542.2552 | 2526.99 |
| 54552.4952 | 2550.92 |
| 54562.7352 | 2532.62 |
| 54572.9752 | 2553.73 |
| 54583.2151 | 2566.4 |
| 54593.4551 | 2564.99 |
| 54603.6951 | 2562.18 |
| 54613.9351 | 2562.18 |
| 54624.175 | 2560.77 |
| 54634.415 | 2559.36 |
| 54644.655 | 2566.4 |
| 54654.8949 | 2566.4 |
| 54665.1349 | 2567.81 |
| 54675.3749 | 2567.81 |
| 54685.6149 | 2567.81 |
| 54695.8548 | 2570.62 |
| 54706.0948 | 2570.62 |
| 54716.3348 | 2587.52 |
| 54726.5747 | 2587.52 |
| 54736.8147 | 2591.74 |
| 54747.0547 | 2593.15 |
| 54757.2947 | 2593.15 |
| 54767.5346 | 2583.29 |
| 54777.7746 | 2590.33 |
| 54788.0146 | 2593.15 |
| 54798.2546 | 2593.15 |
| 54808.4945 | 2598.78 |
| 54818.7345 | 2618.48 |
| 54828.9745 | 2621.3 |
| 54839.2144 | 2621.3 |
| 54849.4544 | 2624.11 |
| 54859.6944 | 2624.11 |
| 54869.9344 | 2641 |
| 54880.1743 | 2641 |
| 54890.4143 | 2643.82 |
| 54900.6543 | 2643.82 |
| 54910.8942 | 2645.23 |
| 54921.1342 | 2660.71 |
| 54931.3742 | 2663.53 |
| 54941.6142 | 2650.86 |
| 54951.8541 | 2662.12 |
| 54962.0941 | 2662.12 |
| 54972.3341 | 2666.34 |
| 54982.574 | 2659.3 |
| 54992.814 | 2674.79 |
| 55003.054 | 2666.34 |
| 55013.294 | 2683.23 |
| 55023.5339 | 2677.6 |
| 55033.7739 | 2695.9 |
| 55044.0139 | 2684.64 |
| 55054.2539 | 2681.83 |
| 55064.4938 | 2691.68 |
| 55074.7338 | 2691.68 |
| 55084.9738 | 2717.02 |
| 55095.2137 | 2704.35 |
| 55105.4537 | 2725.46 |
| 55115.6937 | 2714.2 |
| 55125.9337 | 2707.16 |
| 55136.1736 | 2735.31 |
| 55146.4136 | 2743.76 |
| 55156.6536 | 2778.95 |
| 55166.8935 | 2777.54 |
| 55177.1335 | 2769.1 |
| 55187.3735 | 2769.1 |
| 55197.6135 | 2778.95 |
| 55207.8534 | 2774.73 |
| 55218.0934 | 2774.73 |
| 55228.3334 | 2777.54 |
| 55238.5733 | 2773.32 |
| 55248.8133 | 2778.95 |
| 55259.0533 | 2773.32 |
| 55269.2933 | 2770.51 |
| 55279.5332 | 2770.51 |
| 55289.7732 | 2774.73 |
| 55300.0132 | 2770.51 |
| 55310.2531 | 2770.51 |
| 55320.4931 | 2770.51 |
| 55330.7331 | 2770.51 |
| 55340.9731 | 2770.51 |
| 55351.213 | 2770.51 |
| 55361.453 | 2766.28 |
| 55371.693 | 2773.32 |
| 55381.933 | 2773.32 |
| 55392.1729 | 2770.51 |
| 55402.4129 | 2763.47 |
| 55412.6529 | 2764.87 |
| 55422.8928 | 2759.24 |
| 55433.1328 | 2759.24 |
| 55443.3728 | 2756.43 |
| 55453.6128 | 2756.43 |
| 55463.8527 | 2759.24 |
| 55474.0927 | 2759.24 |
| 55484.3327 | 2755.02 |
| 55494.5726 | 2753.61 |
| 55504.8126 | 2753.61 |
| 55515.0526 | 2753.61 |
| 55525.2926 | 2753.61 |
| 55535.5325 | 2753.61 |
| 55545.7725 | 2752.21 |
| 55556.0125 | 2752.21 |
| 55566.2524 | 2752.21 |
| 55576.4924 | 2759.24 |
| 55586.7324 | 2752.21 |
| 55596.9724 | 2756.43 |
| 55607.2123 | 2755.02 |
| 55617.4523 | 2756.43 |
| 55627.6923 | 2756.43 |
| 55637.9322 | 2756.43 |
| 55648.1722 | 2756.43 |
| 55658.4122 | 2756.43 |
| 55668.6522 | 2756.43 |
| 55678.8921 | 2756.43 |
| 55689.1321 | 2756.43 |
| 55699.3721 | 2756.43 |
| 55709.612 | 2756.43 |
| 55719.852 | 2746.58 |
| 55730.092 | 2756.43 |
| 55740.332 | 2756.43 |
| 55750.5719 | 2756.43 |
| 55760.8119 | 2756.43 |
| 55771.0519 | 2756.43 |
| 55781.2918 | 2756.43 |
| 55791.5318 | 2756.43 |
| 55801.7718 | 2756.43 |
| 55812.0118 | 2702.94 |
| 55822.2517 | 2702.94 |
| 55832.4917 | 2702.94 |
| 55842.7317 | 2702.94 |
| 55852.9716 | 2702.94 |
| 55863.2116 | 2702.94 |
| 55873.4516 | 2702.94 |
| 55883.6916 | 2702.94 |
| 55893.9315 | 2683.23 |
| 55904.1715 | 2702.94 |
| 55914.4115 | 2702.94 |
| 55924.6514 | 2702.94 |
| 55934.8914 | 2700.12 |
| 55945.1314 | 2700.12 |
| 55955.3714 | 2666.34 |
| 55965.6113 | 2695.9 |
| 55975.8513 | 2695.9 |
| 55986.0913 | 2694.49 |
| 55996.3312 | 2693.09 |
| 56006.5712 | 2660.71 |
| 56016.8112 | 2655.08 |
| 56027.0512 | 2652.27 |
| 56037.2911 | 2652.27 |
| 56047.5311 | 2652.27 |
| 56057.7711 | 2659.3 |
| 56068.011 | 2648.04 |
| 56078.251 | 2657.9 |
| 56088.491 | 2656.49 |
| 56098.731 | 2645.23 |
| 56108.9709 | 2626.93 |
| 56119.2109 | 2610.04 |
| 56129.4509 | 2607.22 |
| 56139.6908 | 2605.81 |
| 56149.9308 | 2639.6 |
| 56160.1708 | 2639.6 |
| 56170.4108 | 2604.41 |
| 56180.6507 | 2601.59 |
| 56190.8907 | 2577.66 |
| 56201.1307 | 2595.96 |
| 56211.3706 | 2600.18 |
| 56221.6106 | 2600.18 |
| 56231.8506 | 2598.78 |
| 56242.0906 | 2597.37 |
| 56252.3305 | 2597.37 |
| 56262.5705 | 2597.37 |
| 56272.8105 | 2579.07 |
| 56283.0504 | 2567.81 |
| 56293.2904 | 2576.25 |
| 56303.5304 | 2557.96 |
| 56313.7704 | 2555.14 |
| 56324.0103 | 2573.44 |
| 56334.2503 | 2555.14 |
| 56344.4903 | 2553.73 |
| 56354.7302 | 2552.32 |
| 56364.9702 | 2548.1 |
| 56375.2102 | 2549.51 |
| 56385.4502 | 2549.51 |
| 56395.6901 | 2549.51 |
| 56405.9301 | 2548.1 |
| 56416.1701 | 2536.84 |
| 56426.41 | 2536.84 |
| 56436.65 | 2534.03 |
| 56446.89 | 2548.1 |
| 56457.13 | 2548.1 |
| 56467.3699 | 2546.69 |
| 56477.6099 | 2546.69 |
| 56487.8499 | 2546.69 |
| 56498.0898 | 2519.95 |
| 56508.3298 | 2514.32 |
| 56518.5698 | 2512.77 |
| 56528.8098 | 2511.25 |
| 56539.0497 | 2509.74 |
| 56549.2897 | 2508.26 |
| 56559.5297 | 2506.8 |
| 56569.7696 | 2505.36 |
| 56580.0096 | 2503.94 |
| 56590.2496 | 2502.54 |
| 56600.4895 | 2501.17 |
| 56610.7295 | 2499.81 |
| 56620.9695 | 2498.48 |
| 56631.2095 | 2497.17 |
| 56641.4494 | 2495.88 |
| 56651.6894 | 2494.61 |
| 56661.9294 | 2493.37 |
| 56672.1693 | 2492.14 |
| 56682.4093 | 2490.94 |
| 56692.6493 | 2489.76 |
| 56702.8893 | 2488.6 |
| 56713.1292 | 2487.46 |
| 56723.3692 | 2486.34 |
| 56733.6092 | 2485.25 |
| 56743.8491 | 2484.17 |
| 56754.0891 | 2483.12 |
| 56764.3291 | 2482.09 |
| 56774.5691 | 2481.08 |
| 56784.809 | 2480.09 |
| 56795.049 | 2479.13 |
| 56804.8627 | -9999 |